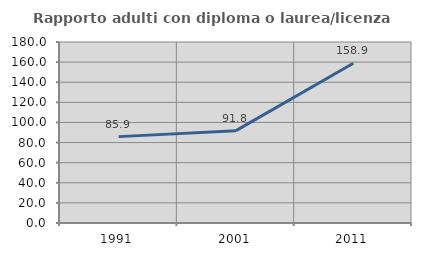
| Category | Rapporto adulti con diploma o laurea/licenza media  |
|---|---|
| 1991.0 | 85.897 |
| 2001.0 | 91.848 |
| 2011.0 | 158.857 |